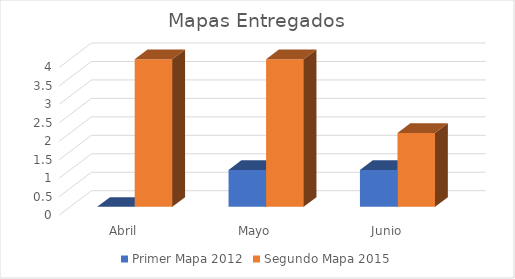
| Category | Primer Mapa 2012 | Segundo Mapa 2015 |
|---|---|---|
| Abril | 0 | 4 |
| Mayo | 1 | 4 |
| Junio | 1 | 2 |